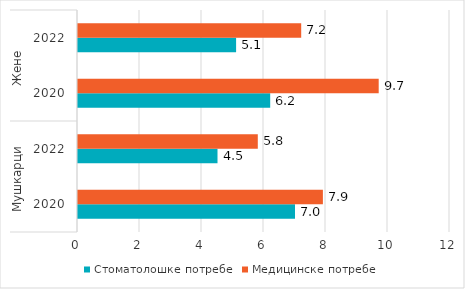
| Category | Стоматолошке потребе | Медицинске потребе |
|---|---|---|
| 0 | 7 | 7.9 |
| 1 | 4.5 | 5.8 |
| 2 | 6.2 | 9.7 |
| 3 | 5.1 | 7.2 |